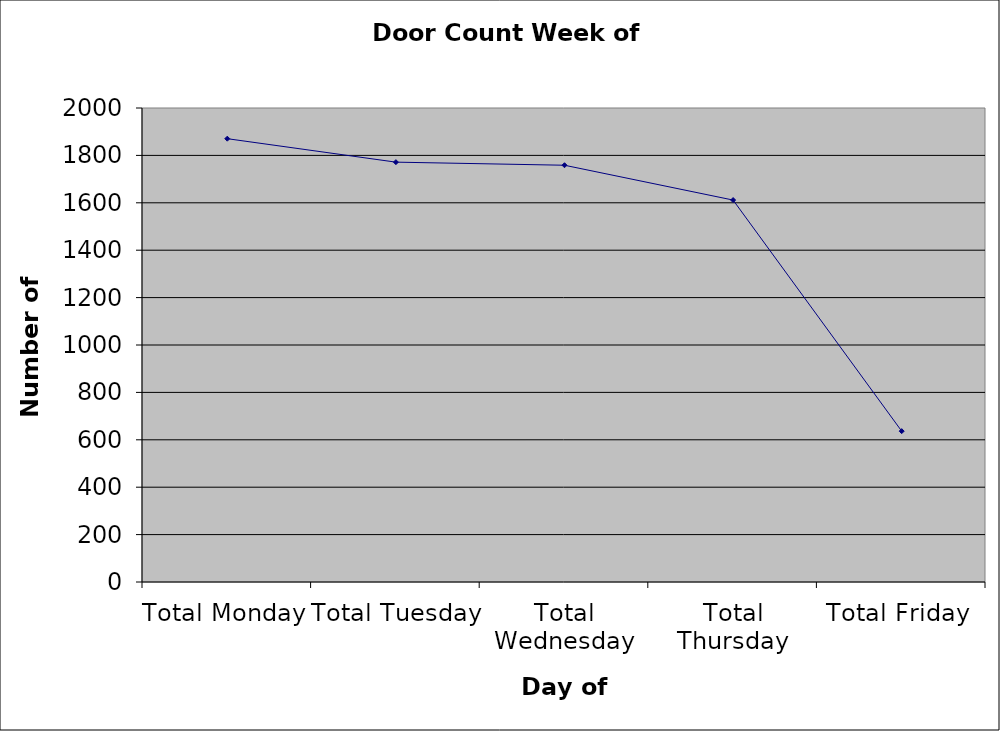
| Category | Series 0 |
|---|---|
| Total Monday | 1870.5 |
| Total Tuesday | 1771.5 |
| Total Wednesday | 1758.5 |
| Total Thursday | 1611.5 |
| Total Friday | 636.5 |